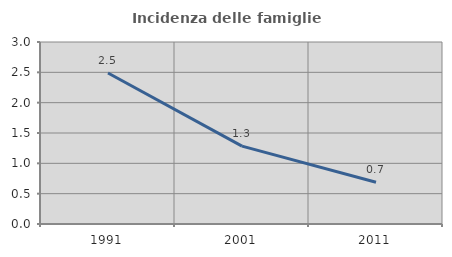
| Category | Incidenza delle famiglie numerose |
|---|---|
| 1991.0 | 2.489 |
| 2001.0 | 1.283 |
| 2011.0 | 0.687 |